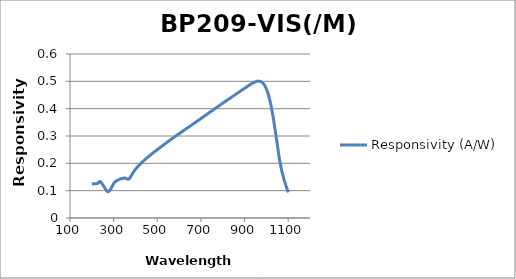
| Category | Responsivity (A/W) |
|---|---|
| 200.0 | 0.124 |
| 205.0 | 0.125 |
| 210.0 | 0.126 |
| 215.0 | 0.125 |
| 220.0 | 0.126 |
| 225.0 | 0.126 |
| 230.0 | 0.128 |
| 235.0 | 0.134 |
| 240.0 | 0.133 |
| 245.0 | 0.128 |
| 250.0 | 0.121 |
| 255.0 | 0.115 |
| 260.0 | 0.109 |
| 265.0 | 0.103 |
| 270.0 | 0.098 |
| 275.0 | 0.096 |
| 280.0 | 0.099 |
| 285.0 | 0.104 |
| 290.0 | 0.111 |
| 295.0 | 0.119 |
| 300.0 | 0.126 |
| 305.0 | 0.131 |
| 310.0 | 0.134 |
| 315.0 | 0.137 |
| 320.0 | 0.139 |
| 325.0 | 0.141 |
| 330.0 | 0.143 |
| 335.0 | 0.144 |
| 340.0 | 0.145 |
| 345.0 | 0.145 |
| 350.0 | 0.147 |
| 355.0 | 0.145 |
| 360.0 | 0.143 |
| 365.0 | 0.143 |
| 370.0 | 0.143 |
| 375.0 | 0.148 |
| 380.0 | 0.154 |
| 385.0 | 0.161 |
| 390.0 | 0.167 |
| 395.0 | 0.173 |
| 400.0 | 0.178 |
| 405.0 | 0.183 |
| 410.0 | 0.187 |
| 415.0 | 0.192 |
| 420.0 | 0.196 |
| 425.0 | 0.2 |
| 430.0 | 0.204 |
| 435.0 | 0.207 |
| 440.0 | 0.211 |
| 445.0 | 0.215 |
| 450.0 | 0.218 |
| 455.0 | 0.221 |
| 460.0 | 0.225 |
| 465.0 | 0.228 |
| 470.0 | 0.231 |
| 475.0 | 0.235 |
| 480.0 | 0.238 |
| 485.0 | 0.241 |
| 490.0 | 0.244 |
| 495.0 | 0.247 |
| 500.0 | 0.25 |
| 505.0 | 0.253 |
| 510.0 | 0.256 |
| 515.0 | 0.259 |
| 520.0 | 0.262 |
| 525.0 | 0.265 |
| 530.0 | 0.268 |
| 535.0 | 0.271 |
| 540.0 | 0.274 |
| 545.0 | 0.277 |
| 550.0 | 0.28 |
| 555.0 | 0.283 |
| 560.0 | 0.286 |
| 565.0 | 0.289 |
| 570.0 | 0.292 |
| 575.0 | 0.294 |
| 580.0 | 0.297 |
| 585.0 | 0.3 |
| 590.0 | 0.303 |
| 595.0 | 0.306 |
| 600.0 | 0.308 |
| 605.0 | 0.311 |
| 610.0 | 0.314 |
| 615.0 | 0.317 |
| 620.0 | 0.319 |
| 625.0 | 0.322 |
| 630.0 | 0.325 |
| 635.0 | 0.328 |
| 640.0 | 0.331 |
| 645.0 | 0.333 |
| 650.0 | 0.336 |
| 655.0 | 0.339 |
| 660.0 | 0.342 |
| 665.0 | 0.344 |
| 670.0 | 0.347 |
| 675.0 | 0.35 |
| 680.0 | 0.353 |
| 685.0 | 0.356 |
| 690.0 | 0.358 |
| 695.0 | 0.361 |
| 700.0 | 0.364 |
| 705.0 | 0.367 |
| 710.0 | 0.369 |
| 715.0 | 0.372 |
| 720.0 | 0.375 |
| 725.0 | 0.378 |
| 730.0 | 0.381 |
| 735.0 | 0.384 |
| 740.0 | 0.386 |
| 745.0 | 0.389 |
| 750.0 | 0.392 |
| 755.0 | 0.395 |
| 760.0 | 0.398 |
| 765.0 | 0.4 |
| 770.0 | 0.403 |
| 775.0 | 0.406 |
| 780.0 | 0.409 |
| 785.0 | 0.412 |
| 790.0 | 0.414 |
| 795.0 | 0.417 |
| 800.0 | 0.42 |
| 805.0 | 0.423 |
| 810.0 | 0.425 |
| 815.0 | 0.428 |
| 820.0 | 0.431 |
| 825.0 | 0.434 |
| 830.0 | 0.436 |
| 835.0 | 0.439 |
| 840.0 | 0.442 |
| 845.0 | 0.444 |
| 850.0 | 0.447 |
| 855.0 | 0.45 |
| 860.0 | 0.453 |
| 865.0 | 0.455 |
| 870.0 | 0.458 |
| 875.0 | 0.461 |
| 880.0 | 0.464 |
| 885.0 | 0.466 |
| 890.0 | 0.469 |
| 895.0 | 0.472 |
| 900.0 | 0.474 |
| 905.0 | 0.477 |
| 910.0 | 0.48 |
| 915.0 | 0.482 |
| 920.0 | 0.485 |
| 925.0 | 0.488 |
| 930.0 | 0.49 |
| 935.0 | 0.492 |
| 940.0 | 0.495 |
| 945.0 | 0.497 |
| 950.0 | 0.498 |
| 955.0 | 0.5 |
| 960.0 | 0.501 |
| 965.0 | 0.501 |
| 970.0 | 0.5 |
| 975.0 | 0.499 |
| 980.0 | 0.497 |
| 985.0 | 0.493 |
| 990.0 | 0.488 |
| 995.0 | 0.48 |
| 1000.0 | 0.473 |
| 1005.0 | 0.461 |
| 1010.0 | 0.449 |
| 1015.0 | 0.433 |
| 1020.0 | 0.417 |
| 1025.0 | 0.396 |
| 1030.0 | 0.375 |
| 1035.0 | 0.349 |
| 1040.0 | 0.323 |
| 1045.0 | 0.296 |
| 1050.0 | 0.27 |
| 1055.0 | 0.242 |
| 1060.0 | 0.215 |
| 1065.0 | 0.195 |
| 1070.0 | 0.175 |
| 1075.0 | 0.159 |
| 1080.0 | 0.143 |
| 1085.0 | 0.13 |
| 1090.0 | 0.117 |
| 1095.0 | 0.106 |
| 1100.0 | 0.094 |